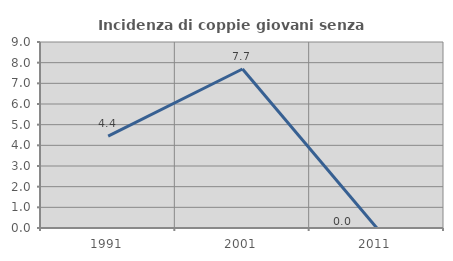
| Category | Incidenza di coppie giovani senza figli |
|---|---|
| 1991.0 | 4.444 |
| 2001.0 | 7.692 |
| 2011.0 | 0 |